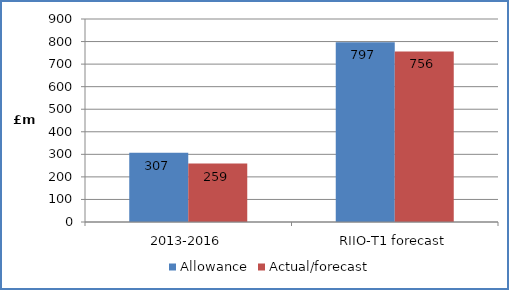
| Category | Allowance | Actual/forecast |
|---|---|---|
| 2013-2016 | 307.432 | 258.897 |
| RIIO-T1 forecast | 796.714 | 756 |